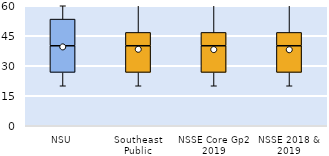
| Category | 25th | 50th | 75th |
|---|---|---|---|
| NSU | 26.667 | 13.333 | 13.333 |
| Southeast Public | 26.667 | 13.333 | 6.667 |
| NSSE Core Gp2 2019 | 26.667 | 13.333 | 6.667 |
| NSSE 2018 & 2019 | 26.667 | 13.333 | 6.667 |